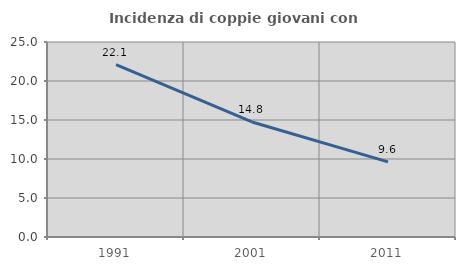
| Category | Incidenza di coppie giovani con figli |
|---|---|
| 1991.0 | 22.108 |
| 2001.0 | 14.752 |
| 2011.0 | 9.637 |